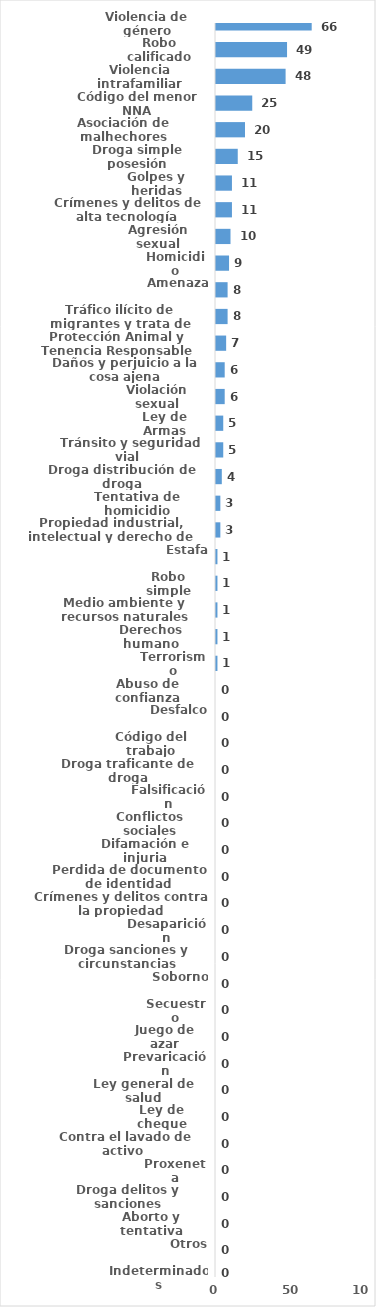
| Category | Series 0 |
|---|---|
| Violencia de género | 66 |
| Robo calificado | 49 |
| Violencia intrafamiliar | 48 |
| Código del menor NNA | 25 |
| Asociación de malhechores | 20 |
| Droga simple posesión | 15 |
| Golpes y heridas | 11 |
| Crímenes y delitos de alta tecnología | 11 |
| Agresión sexual | 10 |
| Homicidio | 9 |
| Amenaza | 8 |
| Tráfico ilícito de migrantes y trata de personas | 8 |
| Protección Animal y Tenencia Responsable | 7 |
| Daños y perjuicio a la cosa ajena | 6 |
| Violación sexual | 6 |
| Ley de Armas | 5 |
| Tránsito y seguridad vial  | 5 |
| Droga distribución de droga | 4 |
| Tentativa de homicidio | 3 |
| Propiedad industrial, intelectual y derecho de autor | 3 |
| Estafa | 1 |
| Robo simple | 1 |
| Medio ambiente y recursos naturales | 1 |
| Derechos humano | 1 |
| Terrorismo | 1 |
| Abuso de confianza | 0 |
| Desfalco | 0 |
| Código del trabajo | 0 |
| Droga traficante de droga | 0 |
| Falsificación | 0 |
| Conflictos sociales | 0 |
| Difamación e injuria | 0 |
| Perdida de documento de identidad | 0 |
| Crímenes y delitos contra la propiedad | 0 |
| Desaparición | 0 |
| Droga sanciones y circunstancias agravantes | 0 |
| Soborno | 0 |
| Secuestro | 0 |
| Juego de azar | 0 |
| Prevaricación | 0 |
| Ley general de salud | 0 |
| Ley de cheque | 0 |
| Contra el lavado de activo  | 0 |
| Proxeneta | 0 |
| Droga delitos y sanciones | 0 |
| Aborto y tentativa | 0 |
| Otros | 0 |
| Indeterminados | 0 |